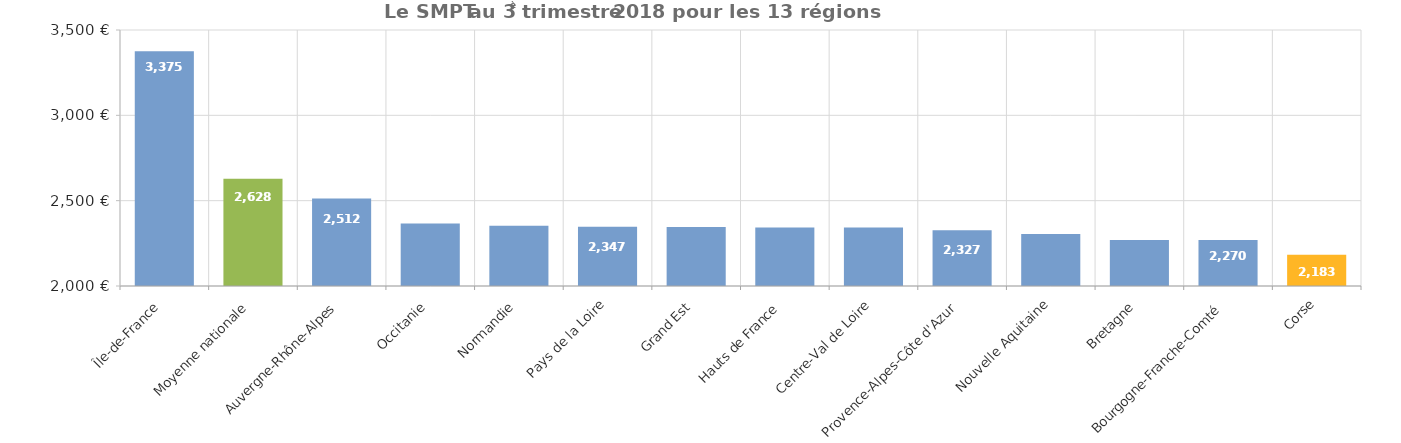
| Category | SMTP |
|---|---|
| Île-de-France | 3375 |
| Moyenne nationale | 2628 |
| Auvergne-Rhône-Alpes | 2512 |
| Occitanie | 2366 |
| Normandie | 2353 |
| Pays de la Loire | 2347 |
| Grand Est | 2345 |
| Hauts de France | 2343 |
| Centre-Val de Loire | 2343 |
| Provence-Alpes-Côte d'Azur | 2327 |
| Nouvelle Aquitaine | 2304 |
| Bretagne | 2270 |
| Bourgogne-Franche-Comté | 2270 |
| Corse | 2183 |